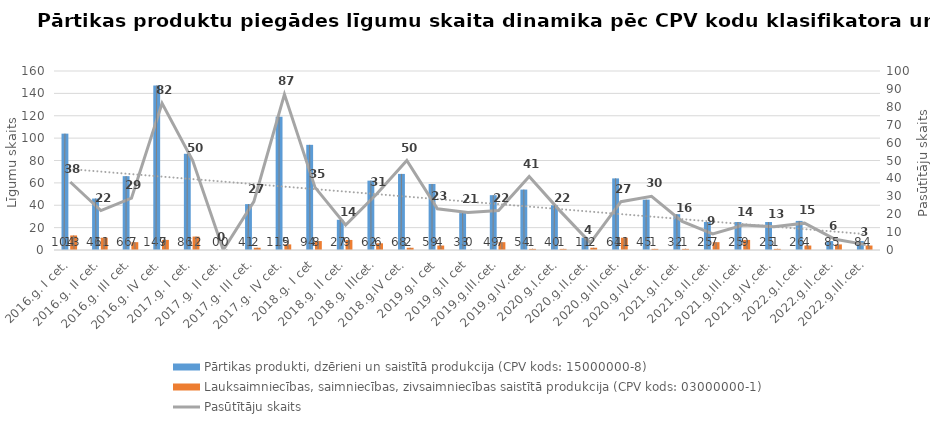
| Category | Pārtikas produkti, dzērieni un saistītā produkcija (CPV kods: 15000000-8) | Lauksaimniecības, saimniecības, zivsaimniecības saistītā produkcija (CPV kods: 03000000-1) |
|---|---|---|
| 2016.g. I cet. | 104 | 13 |
| 2016.g. II cet. | 46 | 11 |
| 2016.g. III cet. | 66 | 7 |
| 2016.g. IV cet. | 147 | 9 |
| 2017.g. I cet. | 86 | 12 |
| 2017.g. II cet. | 0 | 0 |
| 2017.g. III cet. | 41 | 2 |
| 2017.g. IV cet. | 119 | 5 |
| 2018.g. I cet | 94 | 8 |
| 2018.g. II cet. | 27 | 9 |
| 2018.g. IIIcet. | 62 | 6 |
| 2018.g.IV cet. | 68 | 2 |
| 2019.g.I cet | 59 | 4 |
| 2019.g.II cet | 33 | 0 |
| 2019.g.III.cet. | 49 | 7 |
| 2019.g.IV.cet. | 54 | 1 |
| 2020.g.I.cet. | 40 | 1 |
| 2020.g.II.cet. | 11 | 2 |
| 2020.g.III.cet. | 64 | 11 |
| 2020.g.IV.cet. | 45 | 1 |
| 2021.g.I.cet. | 32 | 1 |
| 2021.g.II.cet. | 25 | 7 |
| 2021.g.III.cet. | 25 | 9 |
| 2021.g.IV.cet. | 25 | 1 |
| 2022.g.I.cet. | 26 | 4 |
| 2022.g.II.cet. | 8 | 5 |
| 2022.g.III.cet. | 8 | 4 |